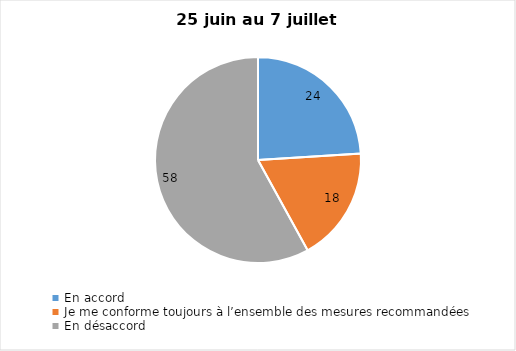
| Category | Series 0 |
|---|---|
| En accord | 24 |
| Je me conforme toujours à l’ensemble des mesures recommandées | 18 |
| En désaccord | 58 |